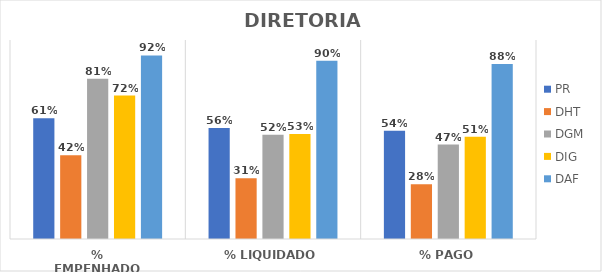
| Category | PR | DHT | DGM | DIG | DAF |
|---|---|---|---|---|---|
| % EMPENHADO | 0.607 | 0.421 | 0.805 | 0.721 | 0.922 |
| % LIQUIDADO | 0.558 | 0.306 | 0.524 | 0.528 | 0.896 |
| % PAGO | 0.544 | 0.275 | 0.475 | 0.514 | 0.879 |